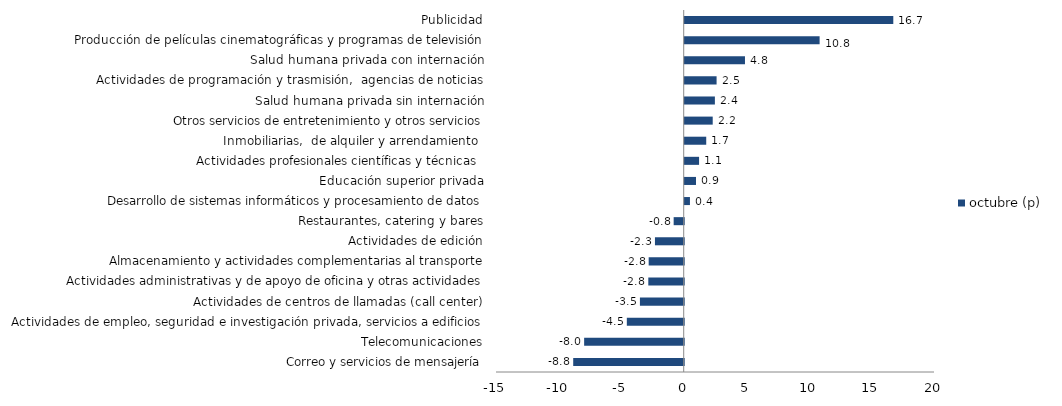
| Category | octubre (p) |
|---|---|
| Correo y servicios de mensajería | -8.831 |
| Telecomunicaciones | -7.957 |
| Actividades de empleo, seguridad e investigación privada, servicios a edificios | -4.546 |
| Actividades de centros de llamadas (call center) | -3.5 |
| Actividades administrativas y de apoyo de oficina y otras actividades | -2.83 |
| Almacenamiento y actividades complementarias al transporte | -2.8 |
| Actividades de edición | -2.298 |
| Restaurantes, catering y bares | -0.803 |
| Desarrollo de sistemas informáticos y procesamiento de datos | 0.418 |
| Educación superior privada | 0.903 |
| Actividades profesionales científicas y técnicas  | 1.147 |
| Inmobiliarias,  de alquiler y arrendamiento  | 1.719 |
| Otros servicios de entretenimiento y otros servicios | 2.237 |
| Salud humana privada sin internación | 2.411 |
| Actividades de programación y trasmisión,  agencias de noticias | 2.547 |
| Salud humana privada con internación | 4.815 |
| Producción de películas cinematográficas y programas de televisión | 10.78 |
| Publicidad | 16.667 |